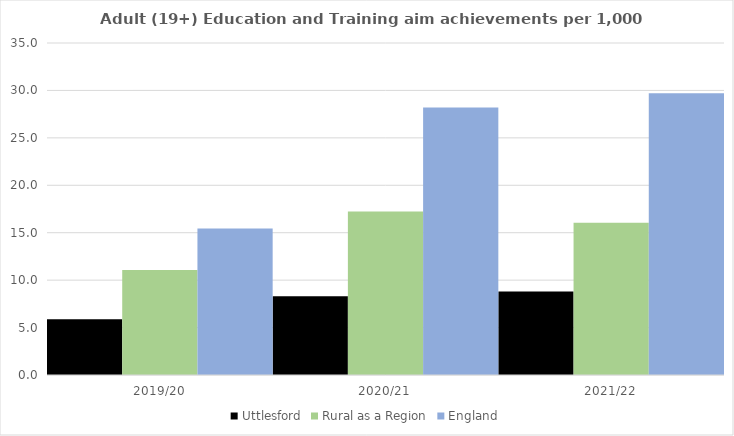
| Category | Uttlesford | Rural as a Region | England |
|---|---|---|---|
| 2019/20 | 5.873 | 11.081 | 15.446 |
| 2020/21 | 8.309 | 17.224 | 28.211 |
| 2021/22 | 8.815 | 16.063 | 29.711 |